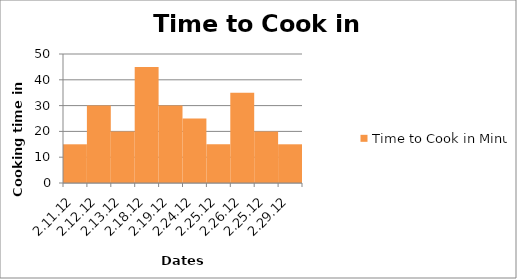
| Category | Time to Cook in Minutes |
|---|---|
| 2.11.12 | 15 |
| 2.12.12 | 30 |
| 2.13.12 | 20 |
| 2.18.12 | 45 |
| 2.19.12 | 30 |
| 2.24.12 | 25 |
| 2.25.12 | 15 |
| 2.26.12 | 35 |
| 2.25.12 | 20 |
| 2.29.12 | 15 |